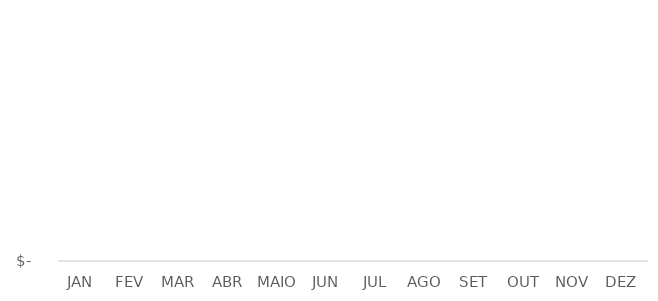
| Category | Series 0 |
|---|---|
| JAN | 0 |
| FEV | 0 |
| MAR | 0 |
| ABR | 0 |
| MAIO | 0 |
| JUN | 0 |
| JUL | 0 |
| AGO | 0 |
| SET | 0 |
| OUT | 0 |
| NOV | 0 |
| DEZ | 0 |